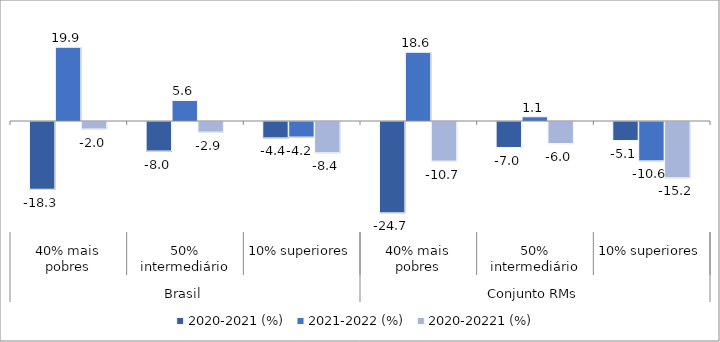
| Category | 2020-2021 (%) | 2021-2022 (%) | 2020-20221 (%) |
|---|---|---|---|
| 0 | -18.309 | 19.931 | -2.028 |
| 1 | -7.979 | 5.554 | -2.868 |
| 2 | -4.433 | -4.2 | -8.447 |
| 3 | -24.687 | 18.573 | -10.699 |
| 4 | -7.026 | 1.143 | -5.963 |
| 5 | -5.131 | -10.632 | -15.218 |